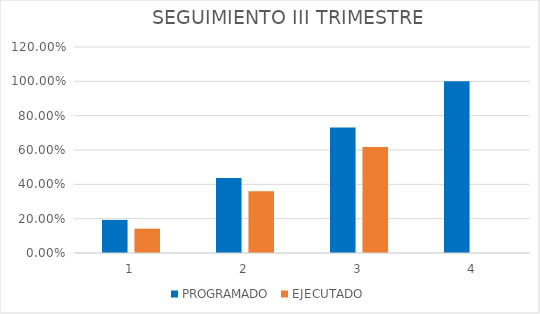
| Category | PROGRAMADO | EJECUTADO |
|---|---|---|
| 0 | 0.193 | 0.142 |
| 1 | 0.438 | 0.36 |
| 2 | 0.731 | 0.618 |
| 3 | 1 | 0 |